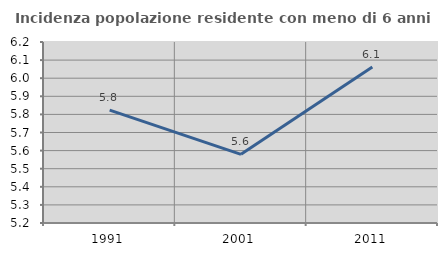
| Category | Incidenza popolazione residente con meno di 6 anni |
|---|---|
| 1991.0 | 5.823 |
| 2001.0 | 5.579 |
| 2011.0 | 6.062 |